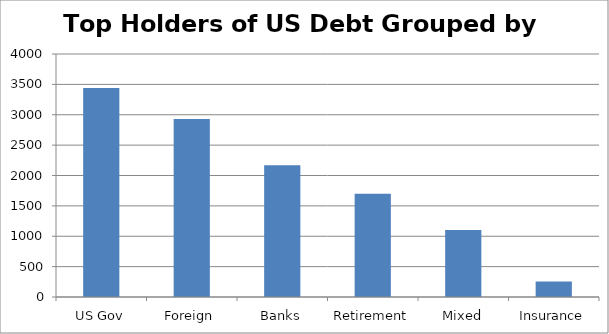
| Category | Total |
|---|---|
| US Gov | 3440 |
| Foreign | 2928 |
| Banks | 2170 |
| Retirement | 1701 |
| Mixed | 1102 |
| Insurance | 254 |